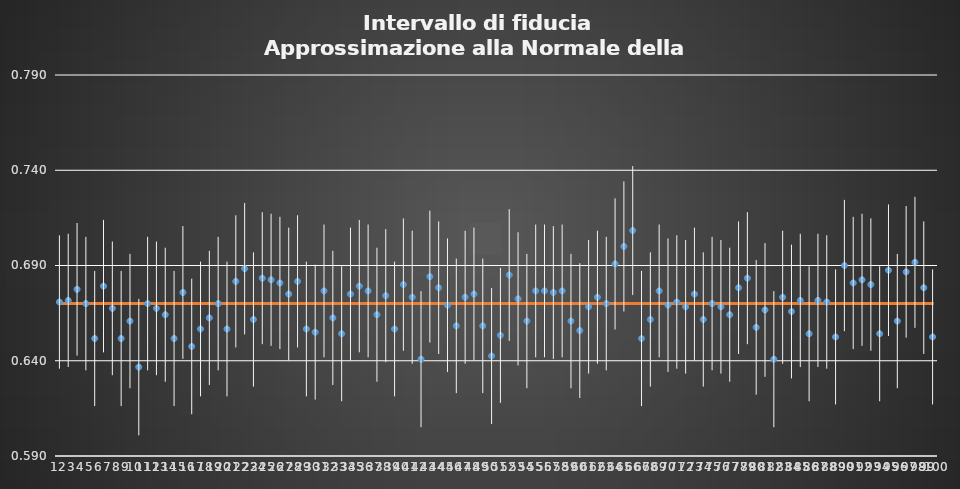
| Category | Series 1 |
|---|---|
| 0 | 0.67 |
| 1 | 0.67 |
| 2 | 0.67 |
| 3 | 0.67 |
| 4 | 0.67 |
| 5 | 0.67 |
| 6 | 0.67 |
| 7 | 0.67 |
| 8 | 0.67 |
| 9 | 0.67 |
| 10 | 0.67 |
| 11 | 0.67 |
| 12 | 0.67 |
| 13 | 0.67 |
| 14 | 0.67 |
| 15 | 0.67 |
| 16 | 0.67 |
| 17 | 0.67 |
| 18 | 0.67 |
| 19 | 0.67 |
| 20 | 0.67 |
| 21 | 0.67 |
| 22 | 0.67 |
| 23 | 0.67 |
| 24 | 0.67 |
| 25 | 0.67 |
| 26 | 0.67 |
| 27 | 0.67 |
| 28 | 0.67 |
| 29 | 0.67 |
| 30 | 0.67 |
| 31 | 0.67 |
| 32 | 0.67 |
| 33 | 0.67 |
| 34 | 0.67 |
| 35 | 0.67 |
| 36 | 0.67 |
| 37 | 0.67 |
| 38 | 0.67 |
| 39 | 0.67 |
| 40 | 0.67 |
| 41 | 0.67 |
| 42 | 0.67 |
| 43 | 0.67 |
| 44 | 0.67 |
| 45 | 0.67 |
| 46 | 0.67 |
| 47 | 0.67 |
| 48 | 0.67 |
| 49 | 0.67 |
| 50 | 0.67 |
| 51 | 0.67 |
| 52 | 0.67 |
| 53 | 0.67 |
| 54 | 0.67 |
| 55 | 0.67 |
| 56 | 0.67 |
| 57 | 0.67 |
| 58 | 0.67 |
| 59 | 0.67 |
| 60 | 0.67 |
| 61 | 0.67 |
| 62 | 0.67 |
| 63 | 0.67 |
| 64 | 0.67 |
| 65 | 0.67 |
| 66 | 0.67 |
| 67 | 0.67 |
| 68 | 0.67 |
| 69 | 0.67 |
| 70 | 0.67 |
| 71 | 0.67 |
| 72 | 0.67 |
| 73 | 0.67 |
| 74 | 0.67 |
| 75 | 0.67 |
| 76 | 0.67 |
| 77 | 0.67 |
| 78 | 0.67 |
| 79 | 0.67 |
| 80 | 0.67 |
| 81 | 0.67 |
| 82 | 0.67 |
| 83 | 0.67 |
| 84 | 0.67 |
| 85 | 0.67 |
| 86 | 0.67 |
| 87 | 0.67 |
| 88 | 0.67 |
| 89 | 0.67 |
| 90 | 0.67 |
| 91 | 0.67 |
| 92 | 0.67 |
| 93 | 0.67 |
| 94 | 0.67 |
| 95 | 0.67 |
| 96 | 0.67 |
| 97 | 0.67 |
| 98 | 0.67 |
| 99 | 0.67 |